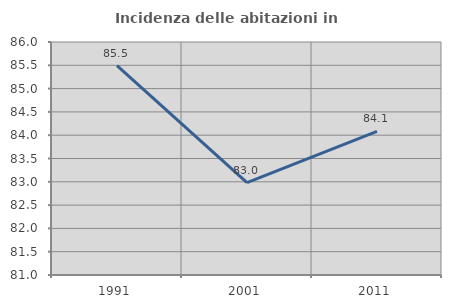
| Category | Incidenza delle abitazioni in proprietà  |
|---|---|
| 1991.0 | 85.492 |
| 2001.0 | 82.984 |
| 2011.0 | 84.084 |